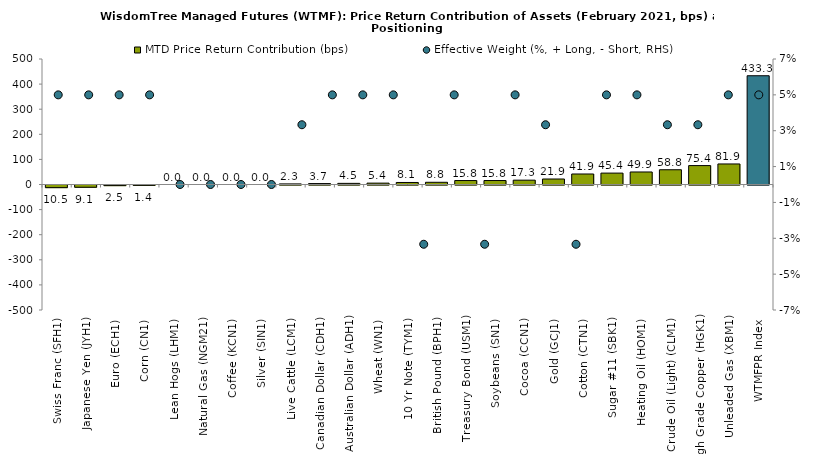
| Category | MTD Price Return Contribution (bps) |
|---|---|
| Swiss Franc (SFH1) | -10.542 |
| Japanese Yen (JYH1) | -9.057 |
| Euro (ECH1) | -2.532 |
| Corn (CN1) | -1.398 |
| Lean Hogs (LHM1) | 0 |
| Natural Gas (NGM21) | 0 |
| Coffee (KCN1) | 0 |
| Silver (SIN1) | 0 |
| Live Cattle (LCM1) | 2.338 |
| Canadian Dollar (CDH1) | 3.68 |
| Australian Dollar (ADH1) | 4.515 |
| Wheat (WN1) | 5.443 |
| 10 Yr Note (TYM1) | 8.08 |
| British Pound (BPH1) | 8.792 |
| Treasury Bond (USM1) | 15.769 |
| Soybeans (SN1) | 15.848 |
| Cocoa (CCN1) | 17.302 |
| Gold (GCJ1) | 21.888 |
| Cotton (CTN1) | 41.858 |
| Sugar #11 (SBK1) | 45.424 |
| Heating Oil (HOM1) | 49.891 |
| Crude Oil (Light) (CLM1) | 58.816 |
| High Grade Copper (HGK1) | 75.355 |
| Unleaded Gas (XBM1) | 81.856 |
| WTMFPR Index | 433.328 |